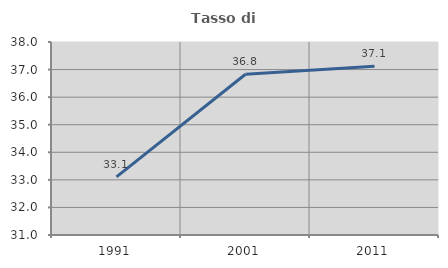
| Category | Tasso di occupazione   |
|---|---|
| 1991.0 | 33.107 |
| 2001.0 | 36.831 |
| 2011.0 | 37.118 |